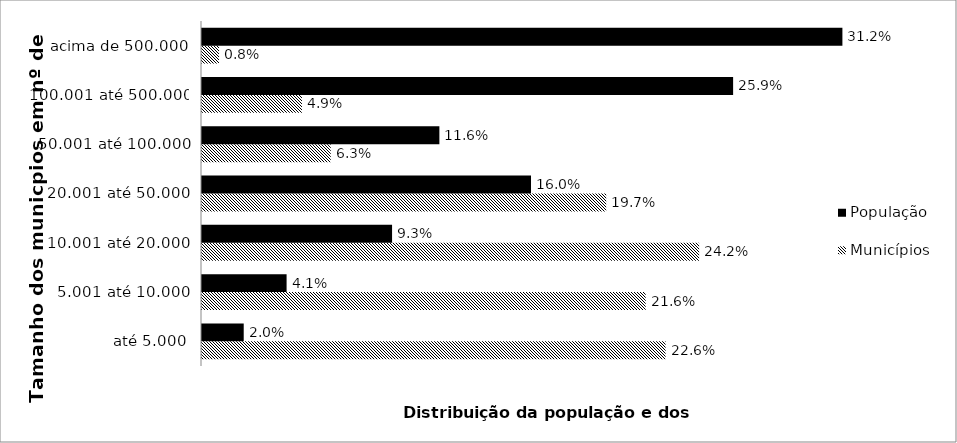
| Category | Municípios | População |
|---|---|---|
|  até 5.000 | 0.226 | 0.02 |
| 5.001 até 10.000 | 0.216 | 0.041 |
| 10.001 até 20.000 | 0.242 | 0.093 |
| 20.001 até 50.000 | 0.197 | 0.16 |
| 50.001 até 100.000 | 0.063 | 0.116 |
| 100.001 até 500.000 | 0.049 | 0.259 |
| acima de 500.000 | 0.008 | 0.312 |